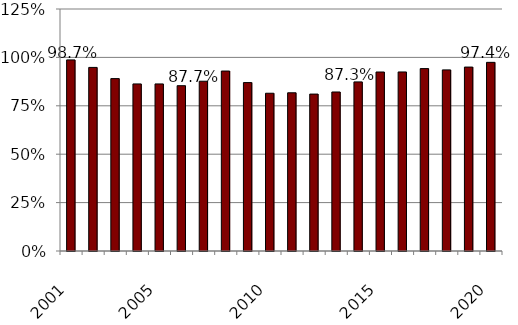
| Category | Series 0 |
|---|---|
| 2001.0 | 0.987 |
| nan | 0.948 |
| nan | 0.89 |
| nan | 0.863 |
| 2005.0 | 0.863 |
| nan | 0.854 |
| nan | 0.877 |
| nan | 0.93 |
| nan | 0.87 |
| 2010.0 | 0.815 |
| nan | 0.817 |
| nan | 0.81 |
| nan | 0.821 |
| nan | 0.873 |
| 2015.0 | 0.925 |
| nan | 0.925 |
| nan | 0.942 |
| nan | 0.936 |
| nan | 0.95 |
| 2020.0 | 0.974 |